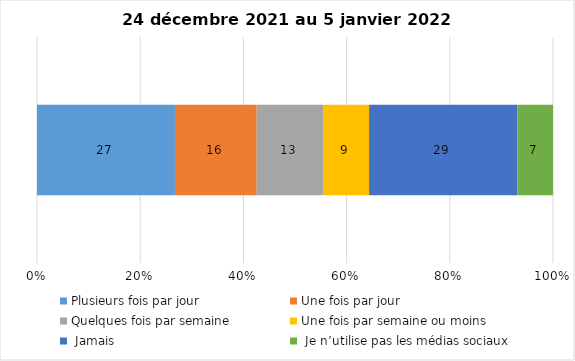
| Category | Plusieurs fois par jour | Une fois par jour | Quelques fois par semaine   | Une fois par semaine ou moins   |  Jamais   |  Je n’utilise pas les médias sociaux |
|---|---|---|---|---|---|---|
| 0 | 27 | 16 | 13 | 9 | 29 | 7 |